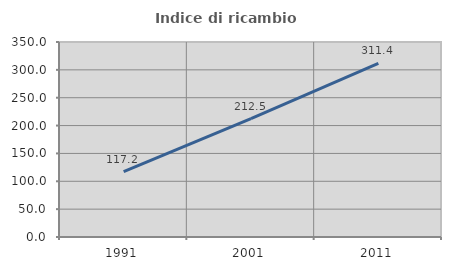
| Category | Indice di ricambio occupazionale  |
|---|---|
| 1991.0 | 117.155 |
| 2001.0 | 212.5 |
| 2011.0 | 311.429 |